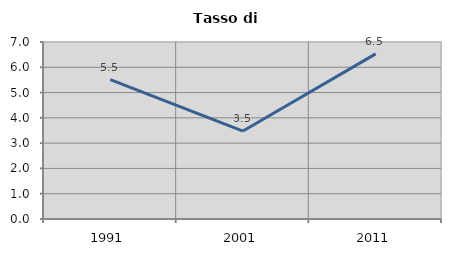
| Category | Tasso di disoccupazione   |
|---|---|
| 1991.0 | 5.512 |
| 2001.0 | 3.477 |
| 2011.0 | 6.529 |